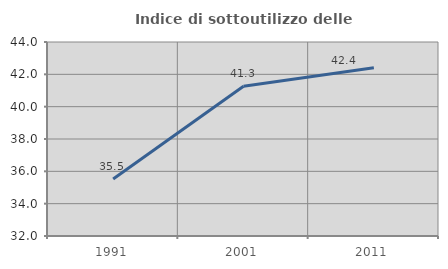
| Category | Indice di sottoutilizzo delle abitazioni  |
|---|---|
| 1991.0 | 35.524 |
| 2001.0 | 41.262 |
| 2011.0 | 42.405 |